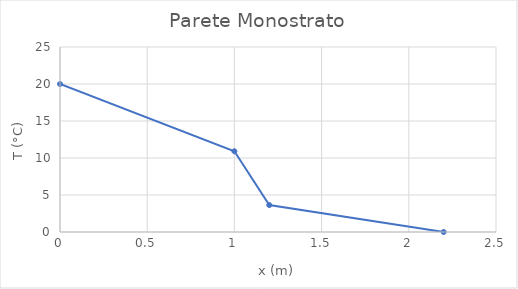
| Category | T (°C) |
|---|---|
| 0.0 | 20 |
| 1.0 | 10.909 |
| 1.2 | 3.636 |
| 2.2 | 0 |